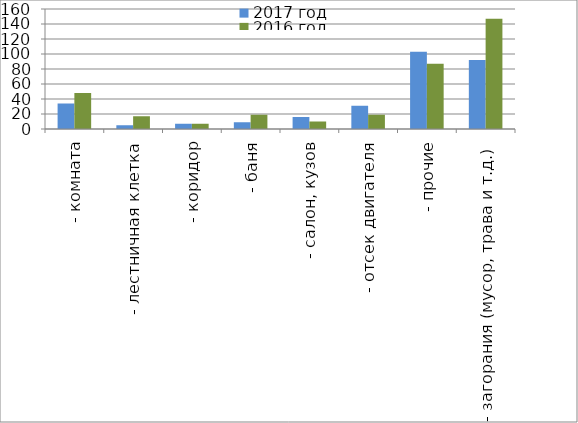
| Category | 2017 год | 2016 год |
|---|---|---|
|  - комната | 34 | 48 |
|  - лестничная клетка | 5 | 17 |
|  - коридор | 7 | 7 |
|  - баня | 9 | 19 |
|  - салон, кузов | 16 | 10 |
|  - отсек двигателя | 31 | 19 |
| - прочие | 103 | 87 |
| - загорания (мусор, трава и т.д.)  | 92 | 147 |